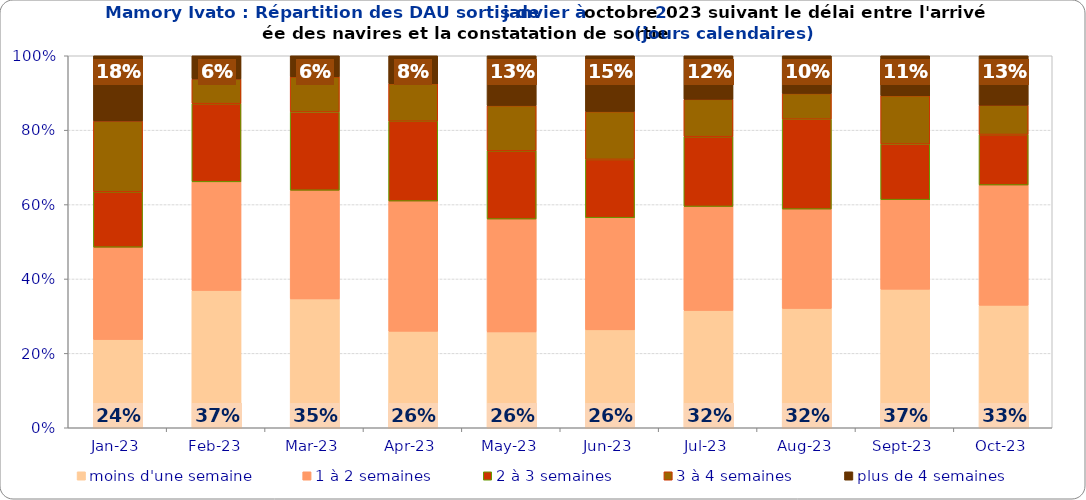
| Category | moins d'une semaine | 1 à 2 semaines | 2 à 3 semaines | 3 à 4 semaines | plus de 4 semaines |
|---|---|---|---|---|---|
| 2023-01-01 | 0.237 | 0.248 | 0.149 | 0.19 | 0.175 |
| 2023-02-01 | 0.369 | 0.292 | 0.21 | 0.066 | 0.062 |
| 2023-03-01 | 0.346 | 0.292 | 0.211 | 0.094 | 0.057 |
| 2023-04-01 | 0.259 | 0.35 | 0.215 | 0.101 | 0.075 |
| 2023-05-01 | 0.258 | 0.303 | 0.184 | 0.121 | 0.134 |
| 2023-06-01 | 0.263 | 0.302 | 0.157 | 0.129 | 0.15 |
| 2023-07-01 | 0.315 | 0.279 | 0.188 | 0.1 | 0.117 |
| 2023-08-01 | 0.321 | 0.267 | 0.242 | 0.069 | 0.101 |
| 2023-09-01 | 0.372 | 0.241 | 0.149 | 0.13 | 0.107 |
| 2023-10-01 | 0.329 | 0.323 | 0.136 | 0.079 | 0.133 |